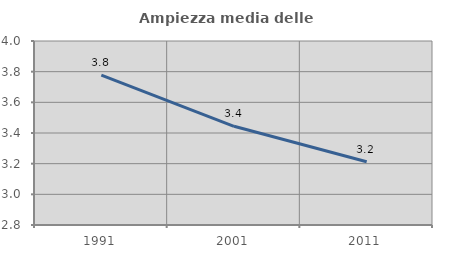
| Category | Ampiezza media delle famiglie |
|---|---|
| 1991.0 | 3.778 |
| 2001.0 | 3.444 |
| 2011.0 | 3.212 |